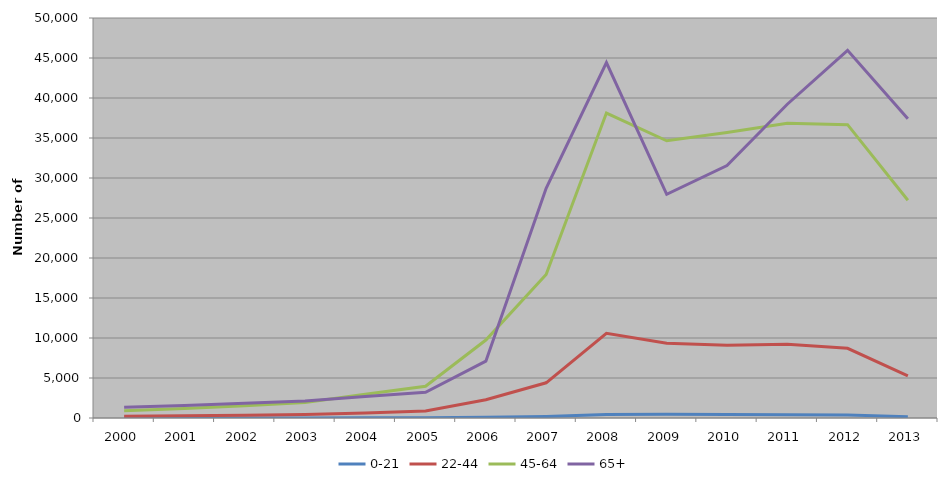
| Category | 0-21 | 22-44 | 45-64 | 65+ |
|---|---|---|---|---|
| 2000 | 4 | 224 | 894 | 1342 |
| 2001 | 9 | 270 | 1189 | 1547 |
| 2002 | 11 | 339 | 1527 | 1845 |
| 2003 | 10 | 443 | 1938 | 2122 |
| 2004 | 22 | 615 | 2972 | 2691 |
| 2005 | 24 | 869 | 3966 | 3206 |
| 2006 | 88 | 2281 | 9747 | 7104 |
| 2007 | 187 | 4400 | 17947 | 28707 |
| 2008 | 438 | 10596 | 38123 | 44433 |
| 2009 | 455 | 9347 | 34657 | 27961 |
| 2010 | 422 | 9079 | 35701 | 31546 |
| 2011 | 412 | 9226 | 36843 | 39222 |
| 2012 | 384 | 8716 | 36670 | 45958 |
| 2013 | 170 | 5266 | 27215 | 37406 |